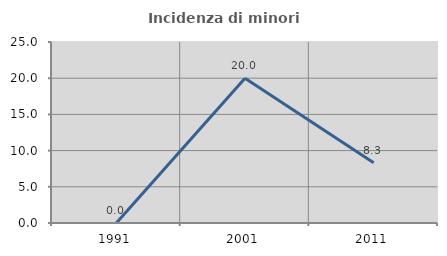
| Category | Incidenza di minori stranieri |
|---|---|
| 1991.0 | 0 |
| 2001.0 | 20 |
| 2011.0 | 8.333 |